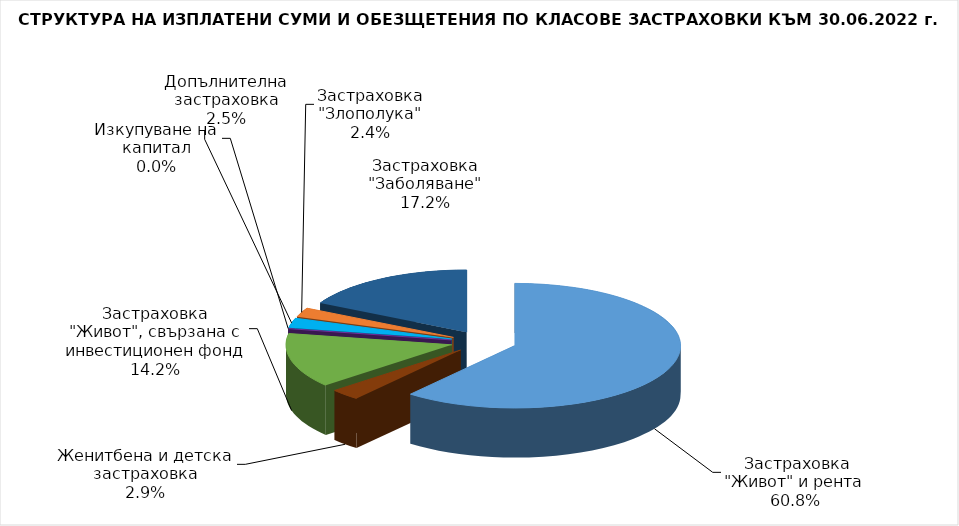
| Category |  Застраховка "Живот" и рента |
|---|---|
|  Застраховка "Живот" и рента | 79720046.478 |
| Женитбена и детска застраховка | 3847336.4 |
| Застраховка "Живот", свързана с инвестиционен фонд | 18570547.816 |
| Изкупуване на капитал | 0 |
| Допълнителна застраховка | 3281207.754 |
| Застраховка "Злополука" | 3093154.485 |
| Застраховка "Заболяване" | 22593817.59 |